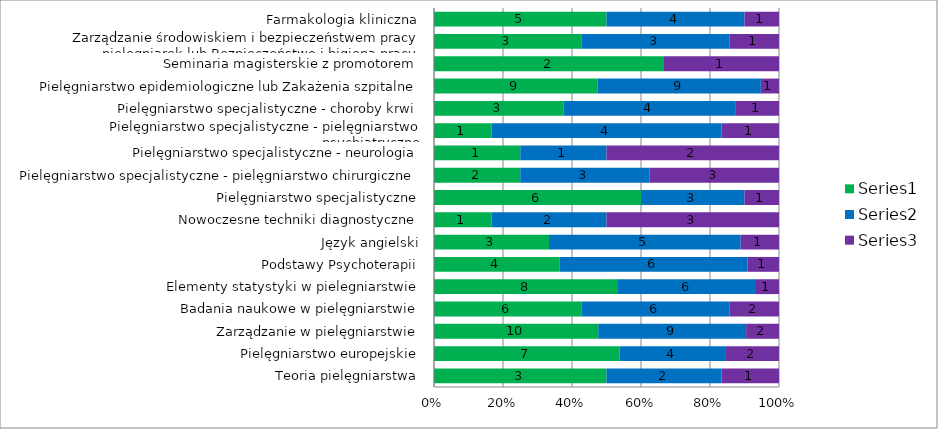
| Category | Series 0 | Series 1 | Series 2 |
|---|---|---|---|
| Teoria pielęgniarstwa | 3 | 2 | 1 |
| Pielęgniarstwo europejskie | 7 | 4 | 2 |
| Zarządzanie w pielęgniarstwie | 10 | 9 | 2 |
| Badania naukowe w pielęgniarstwie | 6 | 6 | 2 |
| Elementy statystyki w pielegniarstwie | 8 | 6 | 1 |
| Podstawy Psychoterapii | 4 | 6 | 1 |
| Język angielski | 3 | 5 | 1 |
| Nowoczesne techniki diagnostyczne | 1 | 2 | 3 |
| Pielęgniarstwo specjalistyczne | 6 | 3 | 1 |
| Pielęgniarstwo specjalistyczne - pielęgniarstwo chirurgiczne | 2 | 3 | 3 |
| Pielęgniarstwo specjalistyczne - neurologia | 1 | 1 | 2 |
| Pielęgniarstwo specjalistyczne - pielęgniarstwo psychiatryczne | 1 | 4 | 1 |
| Pielęgniarstwo specjalistyczne - choroby krwi | 3 | 4 | 1 |
| Pielęgniarstwo epidemiologiczne lub Zakażenia szpitalne | 9 | 9 | 1 |
| Seminaria magisterskie z promotorem | 2 | 0 | 1 |
| Zarządzanie środowiskiem i bezpieczeństwem pracy pielęgniarek lub Bezpieczeństwo i higiena pracy | 3 | 3 | 1 |
| Farmakologia kliniczna | 5 | 4 | 1 |